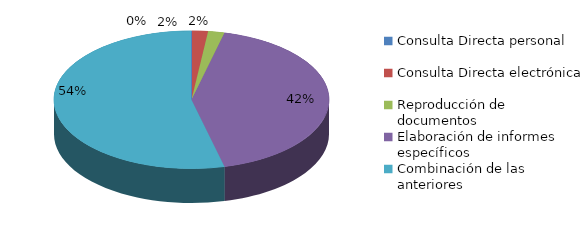
| Category | Series 0 |
|---|---|
| Consulta Directa personal | 0 |
| Consulta Directa electrónica | 2 |
| Reproducción de documentos | 2 |
| Elaboración de informes específicos | 44 |
| Combinación de las anteriores | 56 |